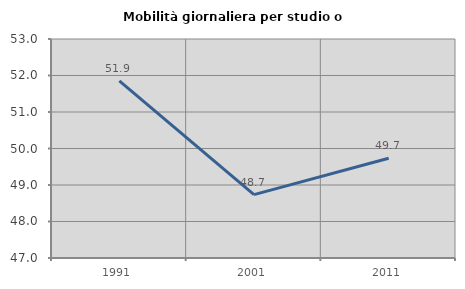
| Category | Mobilità giornaliera per studio o lavoro |
|---|---|
| 1991.0 | 51.853 |
| 2001.0 | 48.737 |
| 2011.0 | 49.733 |